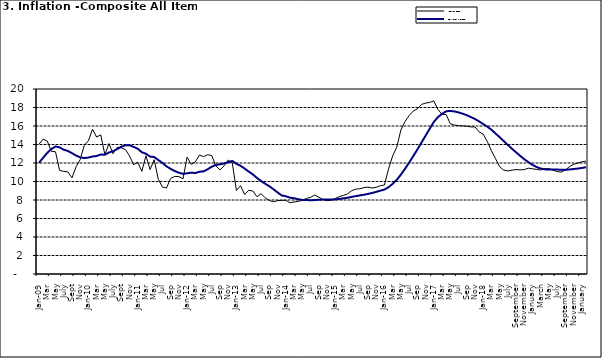
| Category | Year-on Rate | 12-Month Average |
|---|---|---|
| Jan-09 | 14.034 | 12.032 |
| Feb | 14.584 | 12.567 |
| Mar | 14.366 | 13.101 |
| Apr | 13.268 | 13.51 |
| May | 13.212 | 13.787 |
| June | 11.194 | 13.694 |
| July | 11.09 | 13.437 |
| Aug | 11.046 | 13.307 |
| Sept | 10.39 | 13.065 |
| Oct | 11.588 | 12.803 |
| Nov | 12.368 | 12.609 |
| Dec | 13.93 | 12.538 |
| Jan-10 | 14.398 | 12.586 |
| Feb | 15.649 | 12.7 |
| Mar | 14.812 | 12.757 |
| Apr | 15.044 | 12.915 |
| May | 12.915 | 12.893 |
| June | 14.099 | 13.132 |
| July | 13.002 | 13.284 |
| Aug | 13.702 | 13.5 |
| Sept | 13.65 | 13.764 |
| Oct | 13.45 | 13.908 |
| Nov | 12.766 | 13.928 |
| Dec | 11.815 | 13.74 |
| Jan-11 | 12.08 | 13.542 |
| Feb | 11.1 | 13.161 |
| Mar | 12.779 | 13.001 |
| Apr | 11.291 | 12.694 |
| May | 12.352 | 12.648 |
| Jun | 10.23 | 12.321 |
| Jul | 9.397 | 12.009 |
| Aug | 9.301 | 11.635 |
| Sep | 10.339 | 11.363 |
| Oct | 10.544 | 11.13 |
| Nov | 10.54 | 10.952 |
| Dec | 10.283 | 10.826 |
| Jan-12 | 12.626 | 10.886 |
| Feb | 11.866 | 10.955 |
| Mar | 12.111 | 10.914 |
| Apr | 12.866 | 11.054 |
| May | 12.688 | 11.096 |
| Jun | 12.892 | 11.32 |
| Jul | 12.797 | 11.599 |
| Aug | 11.689 | 11.791 |
| Sep | 11.253 | 11.859 |
| Oct | 11.693 | 11.948 |
| Nov | 12.32 | 12.091 |
| Dec | 11.981 | 12.224 |
| Jan-13 | 9.031 | 11.908 |
| Feb | 9.542 | 11.703 |
| Mar | 8.593 | 11.394 |
| Apr | 9.052 | 11.072 |
| May | 8.964 | 10.761 |
| Jun | 8.353 | 10.383 |
| Jul | 8.682 | 10.047 |
| Aug | 8.231 | 9.761 |
| Sep | 7.952 | 9.486 |
| Oct | 7.807 | 9.167 |
| Nov | 7.931 | 8.815 |
| Dec | 7.957 | 8.496 |
| Jan-14 | 7.977 | 8.408 |
| Feb | 7.707 | 8.257 |
| Mar | 7.783 | 8.19 |
| Apr | 7.851 | 8.092 |
| May | 7.965 | 8.012 |
| Jun | 8.167 | 7.998 |
| Jul | 8.281 | 7.968 |
| Aug | 8.534 | 7.996 |
| Sep | 8.317 | 8.027 |
| Oct | 8.06 | 8.047 |
| Nov | 7.927 | 8.046 |
| Dec | 7.978 | 8.047 |
| Jan-15 | 8.157 | 8.063 |
| Feb | 8.359 | 8.117 |
| Mar | 8.494 | 8.176 |
| Apr | 8.655 | 8.243 |
| May | 9.003 | 8.331 |
| Jun | 9.168 | 8.417 |
| Jul | 9.218 | 8.497 |
| Aug | 9.336 | 8.566 |
| Sep | 9.394 | 8.658 |
| Oct | 9.296 | 8.76 |
| Nov | 9.368 | 8.879 |
| Dec | 9.554 | 9.009 |
| Jan-16 | 9.617 | 9.13 |
| Feb | 11.379 | 9.386 |
| Mar | 12.775 | 9.751 |
| Apr | 13.721 | 10.182 |
| May | 15.577 | 10.746 |
| Jun | 16.48 | 11.372 |
| Jul | 17.127 | 12.045 |
| Aug | 17.609 | 12.744 |
| Sep | 17.852 | 13.454 |
| Oct | 18.33 | 14.206 |
| Nov | 18.476 | 14.958 |
| Dec | 18.547 | 15.697 |
| Jan-17 | 18.719 | 16.441 |
| Feb | 17.78 | 16.958 |
| Mar | 17.256 | 17.315 |
| Apr | 17.244 | 17.591 |
| May | 16.251 | 17.628 |
| Jun | 16.098 | 17.578 |
| Jul | 16.053 | 17.475 |
| Aug | 16.012 | 17.331 |
| Sep | 15.979 | 17.17 |
| Oct | 15.905 | 16.968 |
| Nov | 15.901 | 16.76 |
| Dec | 15.372 | 16.502 |
| Jan-18 | 15.127 | 16.215 |
| Feb | 14.33 | 15.93 |
| Mar | 13.337 | 15.599 |
| Apr | 12.482 | 15.196 |
| May | 11.608 | 14.793 |
| June | 11.231 | 14.371 |
| July | 11.142 | 13.95 |
| August | 11.227 | 13.546 |
| September | 11.284 | 13.157 |
| October | 11.259 | 12.777 |
| November | 11.281 | 12.406 |
| December | 11.442 | 12.095 |
| January | 11.374 | 11.801 |
| February | 11.306 | 11.564 |
| March | 11.251 | 11.401 |
| April | 11.372 | 11.314 |
| May | 11.396 | 11.299 |
| June | 11.217 | 11.297 |
| July | 11.084 | 11.291 |
| August | 11.016 | 11.271 |
| September | 11.244 | 11.268 |
| October | 11.607 | 11.298 |
| November | 11.854 | 11.348 |
| December | 11.982 | 11.396 |
| January | 12.132 | 11.462 |
| February | 12.199 | 11.539 |